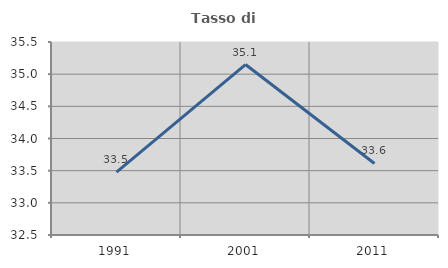
| Category | Tasso di occupazione   |
|---|---|
| 1991.0 | 33.476 |
| 2001.0 | 35.149 |
| 2011.0 | 33.612 |